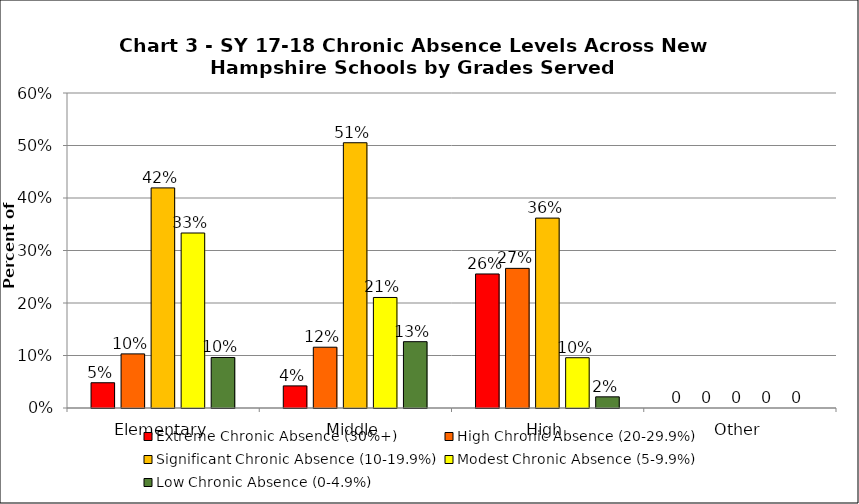
| Category | Extreme Chronic Absence (30%+) | High Chronic Absence (20-29.9%) | Significant Chronic Absence (10-19.9%) | Modest Chronic Absence (5-9.9%) | Low Chronic Absence (0-4.9%) |
|---|---|---|---|---|---|
| 0 | 0.048 | 0.103 | 0.419 | 0.333 | 0.096 |
| 1 | 0.042 | 0.116 | 0.505 | 0.211 | 0.126 |
| 2 | 0.255 | 0.266 | 0.362 | 0.096 | 0.021 |
| 3 | 0 | 0 | 0 | 0 | 0 |